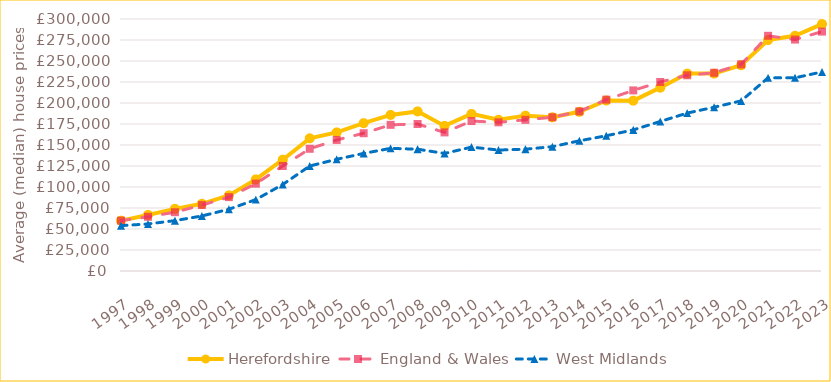
| Category | Herefordshire | England & Wales | West Midlands |
|---|---|---|---|
| 1997 | 60000 | 59950 | 54000 |
| 1998 | 66725 | 64500 | 56000 |
| 1999 | 74000 | 70000 | 59950 |
| 2000 | 80000 | 78500 | 65500 |
| 2001 | 90000 | 87950 | 73500 |
| 2002 | 109000 | 104000 | 85000 |
| 2003 | 132500 | 125000 | 103000 |
| 2004 | 157950 | 145500 | 125000 |
| 2005 | 165000 | 156000 | 133000 |
| 2006 | 176000 | 164000 | 140000 |
| 2007 | 185800 | 174000 | 146000 |
| 2008 | 190000 | 175000 | 145000 |
| 2009 | 172750 | 165000 | 139950 |
| 2010 | 187000 | 178500 | 147500 |
| 2011 | 180000 | 177000 | 144000 |
| 2012 | 184950 | 180000 | 145000 |
| 2013 | 183000 | 183000 | 148000 |
| 2014 | 189500 | 190000 | 155000 |
| 2015 | 203000 | 204000 | 161000 |
| 2016 | 202790 | 215000 | 168000 |
| 2017 | 218250 | 225000 | 178000 |
| 2018 | 235000 | 233000 | 188000 |
| 2019 | 235000 | 236000 | 195000 |
| 2020 | 245000 | 246000 | 202500 |
| 2021 | 275000 | 280000 | 230000 |
| 2022 | 280000 | 275500 | 230000 |
| 2023 | 293997.5 | 285000 | 237000 |